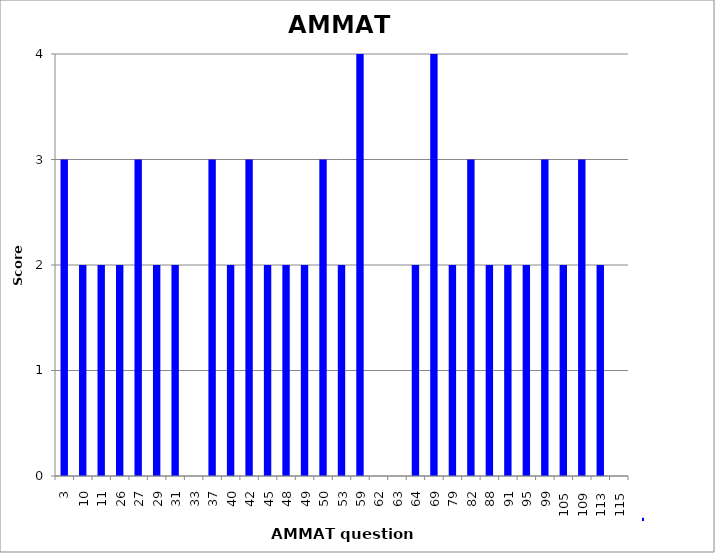
| Category | Series 0 |
|---|---|
| 3.0 | 3 |
| 10.0 | 2 |
| 11.0 | 2 |
| 26.0 | 2 |
| 27.0 | 3 |
| 29.0 | 2 |
| 31.0 | 2 |
| 33.0 | 0 |
| 37.0 | 3 |
| 40.0 | 2 |
| 42.0 | 3 |
| 45.0 | 2 |
| 48.0 | 2 |
| 49.0 | 2 |
| 50.0 | 3 |
| 53.0 | 2 |
| 59.0 | 4 |
| 62.0 | 0 |
| 63.0 | 0 |
| 64.0 | 2 |
| 69.0 | 4 |
| 79.0 | 2 |
| 82.0 | 3 |
| 88.0 | 2 |
| 91.0 | 2 |
| 95.0 | 2 |
| 99.0 | 3 |
| 105.0 | 2 |
| 109.0 | 3 |
| 113.0 | 2 |
| 115.0 | 0 |